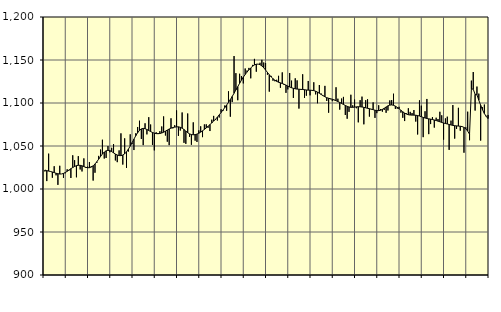
| Category | Piggar | Series 1 |
|---|---|---|
| nan | 1020.4 | 1022.06 |
| 1.0 | 1009.2 | 1021.32 |
| 1.0 | 1041.1 | 1020.83 |
| 1.0 | 1020.2 | 1020.38 |
| 1.0 | 1013.1 | 1019.77 |
| 1.0 | 1026.5 | 1019.11 |
| 1.0 | 1015.9 | 1018.29 |
| 1.0 | 1004.8 | 1017.75 |
| 1.0 | 1027 | 1017.39 |
| 1.0 | 1017.5 | 1017.51 |
| 1.0 | 1012.9 | 1018.12 |
| 1.0 | 1018.3 | 1019.17 |
| nan | 1022.9 | 1020.57 |
| 2.0 | 1021.6 | 1022.12 |
| 2.0 | 1012.8 | 1023.63 |
| 2.0 | 1039.2 | 1024.98 |
| 2.0 | 1033.5 | 1026.19 |
| 2.0 | 1013.6 | 1027.11 |
| 2.0 | 1038.2 | 1027.57 |
| 2.0 | 1022.7 | 1027.54 |
| 2.0 | 1020.4 | 1026.97 |
| 2.0 | 1035.6 | 1026.07 |
| 2.0 | 1024.5 | 1025.22 |
| 2.0 | 1026 | 1024.72 |
| nan | 1031.4 | 1024.78 |
| 3.0 | 1026.6 | 1025.52 |
| 3.0 | 1009.8 | 1026.97 |
| 3.0 | 1018.9 | 1029.09 |
| 3.0 | 1030.4 | 1031.74 |
| 3.0 | 1038.5 | 1034.75 |
| 3.0 | 1045.9 | 1037.85 |
| 3.0 | 1057.3 | 1040.69 |
| 3.0 | 1035.4 | 1042.93 |
| 3.0 | 1036.1 | 1044.4 |
| 3.0 | 1049.9 | 1044.96 |
| 3.0 | 1042.7 | 1044.61 |
| nan | 1047.9 | 1043.51 |
| 4.0 | 1052.2 | 1042.06 |
| 4.0 | 1033.2 | 1040.64 |
| 4.0 | 1031.2 | 1039.55 |
| 4.0 | 1044.9 | 1038.87 |
| 4.0 | 1064.7 | 1038.8 |
| 4.0 | 1028.4 | 1039.47 |
| 4.0 | 1058.9 | 1040.91 |
| 4.0 | 1024.5 | 1043.22 |
| 4.0 | 1043.5 | 1046.31 |
| 4.0 | 1063.6 | 1049.93 |
| 4.0 | 1052.3 | 1053.86 |
| nan | 1045.3 | 1057.98 |
| 5.0 | 1064.8 | 1061.93 |
| 5.0 | 1072.1 | 1065.41 |
| 5.0 | 1079.4 | 1068.15 |
| 5.0 | 1058.2 | 1069.9 |
| 5.0 | 1051 | 1070.49 |
| 5.0 | 1076.4 | 1070.14 |
| 5.0 | 1063.5 | 1069.18 |
| 5.0 | 1083.5 | 1067.98 |
| 5.0 | 1075 | 1066.82 |
| 5.0 | 1051.3 | 1065.77 |
| 5.0 | 1044.9 | 1064.94 |
| nan | 1066 | 1064.41 |
| 6.0 | 1065.1 | 1064.29 |
| 6.0 | 1067.2 | 1064.55 |
| 6.0 | 1072.7 | 1065.09 |
| 6.0 | 1084.4 | 1065.98 |
| 6.0 | 1062.2 | 1067.25 |
| 6.0 | 1055 | 1068.56 |
| 6.0 | 1051 | 1069.75 |
| 6.0 | 1082.2 | 1070.77 |
| 6.0 | 1070.5 | 1071.48 |
| 6.0 | 1074.2 | 1071.95 |
| 6.0 | 1091.4 | 1072.27 |
| nan | 1061.8 | 1072.28 |
| 7.0 | 1068 | 1071.75 |
| 7.0 | 1089 | 1070.7 |
| 7.0 | 1053.7 | 1069.16 |
| 7.0 | 1052.5 | 1067.31 |
| 7.0 | 1087.8 | 1065.48 |
| 7.0 | 1060.7 | 1064.09 |
| 7.0 | 1051.4 | 1063.3 |
| 7.0 | 1077.5 | 1063.04 |
| 7.0 | 1056.2 | 1063.22 |
| 7.0 | 1054.7 | 1063.84 |
| 7.0 | 1068.2 | 1064.83 |
| nan | 1072.9 | 1066.09 |
| 8.0 | 1060.3 | 1067.63 |
| 8.0 | 1075.1 | 1069.3 |
| 8.0 | 1075.2 | 1071.08 |
| 8.0 | 1071.2 | 1072.98 |
| 8.0 | 1067.4 | 1074.9 |
| 8.0 | 1080.6 | 1076.84 |
| 8.0 | 1085 | 1078.91 |
| 8.0 | 1080.2 | 1081.12 |
| 8.0 | 1079.6 | 1083.54 |
| 8.0 | 1083.1 | 1086.17 |
| 8.0 | 1092.7 | 1088.92 |
| nan | 1090.7 | 1091.75 |
| 9.0 | 1097.1 | 1094.65 |
| 9.0 | 1091 | 1097.65 |
| 9.0 | 1113.6 | 1100.73 |
| 9.0 | 1084.1 | 1104.05 |
| 9.0 | 1101.1 | 1107.62 |
| 9.0 | 1154.6 | 1111.34 |
| 9.0 | 1134.7 | 1115.16 |
| 9.0 | 1103.2 | 1119.02 |
| 9.0 | 1134 | 1122.87 |
| 9.0 | 1131.4 | 1126.59 |
| 9.0 | 1122.8 | 1130.04 |
| nan | 1140.1 | 1133.14 |
| 10.0 | 1137.8 | 1135.93 |
| 10.0 | 1140.8 | 1138.5 |
| 10.0 | 1128.7 | 1140.82 |
| 10.0 | 1144.3 | 1142.76 |
| 10.0 | 1151.3 | 1144.25 |
| 10.0 | 1136.4 | 1145.13 |
| 10.0 | 1145.3 | 1145.23 |
| 10.0 | 1146.8 | 1144.57 |
| 10.0 | 1150.2 | 1143.13 |
| 10.0 | 1147.1 | 1140.95 |
| 10.0 | 1146.5 | 1138.34 |
| nan | 1132.9 | 1135.58 |
| 11.0 | 1113.2 | 1132.86 |
| 11.0 | 1131.5 | 1130.35 |
| 11.0 | 1125.9 | 1128.26 |
| 11.0 | 1125.3 | 1126.58 |
| 11.0 | 1127 | 1125.19 |
| 11.0 | 1131.6 | 1124.16 |
| 11.0 | 1117.7 | 1123.42 |
| 11.0 | 1135.6 | 1122.66 |
| 11.0 | 1120.9 | 1121.79 |
| 11.0 | 1111.8 | 1120.8 |
| 11.0 | 1115.8 | 1119.69 |
| nan | 1134.9 | 1118.62 |
| 12.0 | 1126 | 1117.74 |
| 12.0 | 1105.9 | 1117.05 |
| 12.0 | 1128.7 | 1116.51 |
| 12.0 | 1126.3 | 1116.2 |
| 12.0 | 1093.5 | 1116.01 |
| 12.0 | 1115.3 | 1115.86 |
| 12.0 | 1133.4 | 1115.69 |
| 12.0 | 1105.9 | 1115.45 |
| 12.0 | 1108.5 | 1115.15 |
| 12.0 | 1125.6 | 1114.97 |
| 12.0 | 1108.9 | 1114.87 |
| nan | 1114.9 | 1114.73 |
| 13.0 | 1124.1 | 1114.4 |
| 13.0 | 1110 | 1113.71 |
| 13.0 | 1099.7 | 1112.65 |
| 13.0 | 1120.9 | 1111.33 |
| 13.0 | 1111 | 1109.91 |
| 13.0 | 1108.1 | 1108.53 |
| 13.0 | 1119.9 | 1107.24 |
| 13.0 | 1102.4 | 1106.19 |
| 13.0 | 1088.7 | 1105.51 |
| 13.0 | 1104.4 | 1104.96 |
| 13.0 | 1102.2 | 1104.36 |
| nan | 1103.2 | 1103.62 |
| 14.0 | 1118.3 | 1102.68 |
| 14.0 | 1105 | 1101.68 |
| 14.0 | 1092.3 | 1100.64 |
| 14.0 | 1105.2 | 1099.49 |
| 14.0 | 1107.1 | 1098.31 |
| 14.0 | 1086.1 | 1097.18 |
| 14.0 | 1081.7 | 1096.14 |
| 14.0 | 1089.7 | 1095.36 |
| 14.0 | 1109.6 | 1094.99 |
| 14.0 | 1097.3 | 1094.98 |
| 14.0 | 1104 | 1095.18 |
| nan | 1093.9 | 1095.48 |
| 15.0 | 1077.5 | 1095.66 |
| 15.0 | 1103.3 | 1095.61 |
| 15.0 | 1107.4 | 1095.36 |
| 15.0 | 1075.2 | 1094.95 |
| 15.0 | 1103.3 | 1094.4 |
| 15.0 | 1104.4 | 1093.85 |
| 15.0 | 1084.2 | 1093.36 |
| 15.0 | 1092.4 | 1092.87 |
| 15.0 | 1100.7 | 1092.25 |
| 15.0 | 1082.7 | 1091.6 |
| 15.0 | 1088.2 | 1091.17 |
| nan | 1097.4 | 1091.11 |
| 16.0 | 1092.9 | 1091.58 |
| 16.0 | 1089.9 | 1092.57 |
| 16.0 | 1092 | 1093.89 |
| 16.0 | 1088.6 | 1095.37 |
| 16.0 | 1091.3 | 1096.71 |
| 16.0 | 1103 | 1097.56 |
| 16.0 | 1103.4 | 1097.78 |
| 16.0 | 1110.8 | 1097.35 |
| 16.0 | 1093.1 | 1096.33 |
| 16.0 | 1093.4 | 1094.96 |
| 16.0 | 1095.6 | 1093.34 |
| nan | 1088.8 | 1091.51 |
| 17.0 | 1082.8 | 1089.77 |
| 17.0 | 1079 | 1088.3 |
| 17.0 | 1087.9 | 1087.12 |
| 17.0 | 1093.9 | 1086.35 |
| 17.0 | 1089.7 | 1086.02 |
| 17.0 | 1088.4 | 1085.92 |
| 17.0 | 1091.8 | 1085.89 |
| 17.0 | 1078.4 | 1085.76 |
| 17.0 | 1063.4 | 1085.42 |
| 17.0 | 1103.1 | 1084.86 |
| 17.0 | 1096.9 | 1084.06 |
| nan | 1060.3 | 1083.25 |
| 18.0 | 1090.4 | 1082.54 |
| 18.0 | 1104.7 | 1081.94 |
| 18.0 | 1063.8 | 1081.56 |
| 18.0 | 1075.5 | 1081.24 |
| 18.0 | 1083.6 | 1080.79 |
| 18.0 | 1071.4 | 1080.23 |
| 18.0 | 1082.9 | 1079.62 |
| 18.0 | 1081.4 | 1078.91 |
| 18.0 | 1089.8 | 1078.18 |
| 18.0 | 1085.7 | 1077.41 |
| 18.0 | 1057.4 | 1076.7 |
| nan | 1082.1 | 1076.13 |
| 19.0 | 1084.1 | 1075.62 |
| 19.0 | 1045.5 | 1075.03 |
| 19.0 | 1079.5 | 1074.44 |
| 19.0 | 1097.6 | 1073.94 |
| 19.0 | 1058.6 | 1073.6 |
| 19.0 | 1069.8 | 1073.39 |
| 19.0 | 1094.4 | 1073.18 |
| 19.0 | 1067.8 | 1072.98 |
| 19.0 | 1072.3 | 1072.58 |
| 19.0 | 1042.2 | 1071.63 |
| 19.0 | 1071.7 | 1069.94 |
| nan | 1089.9 | 1067.35 |
| 20.0 | 1056.7 | 1063.72 |
| 20.0 | 1126 | 1116.38 |
| 20.0 | 1136 | 1116.09 |
| 20.0 | 1091.2 | 1110.05 |
| 20.0 | 1119.1 | 1109.54 |
| 20.0 | 1110.9 | 1103.27 |
| 20.0 | 1056.3 | 1097.36 |
| 20.0 | 1095.1 | 1092.08 |
| 20.0 | 1098.2 | 1087.74 |
| 20.0 | 1085.1 | 1084.39 |
| 20.0 | 1086.1 | 1081.88 |